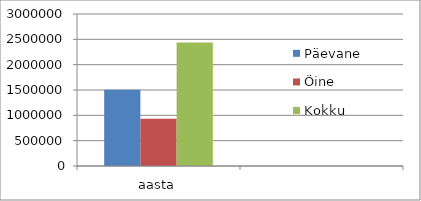
| Category | Päevane | Öine | Kokku |
|---|---|---|---|
| aasta | 1503844.974 | 933349.688 | 2437194.662 |